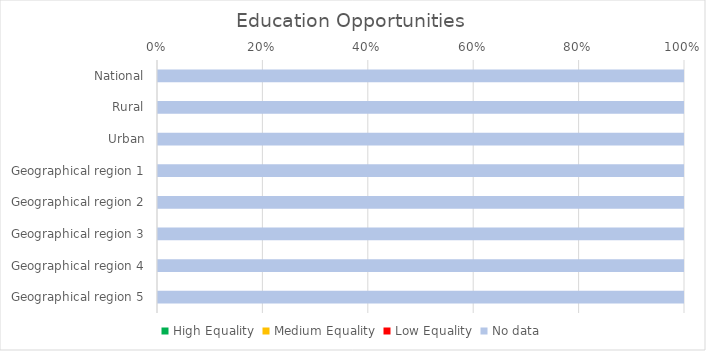
| Category | High Equality | Medium Equality | Low Equality | No data |
|---|---|---|---|---|
| National | 0 | 0 | 0 | 11 |
| Rural | 0 | 0 | 0 | 11 |
| Urban | 0 | 0 | 0 | 11 |
| Geographical region 1 | 0 | 0 | 0 | 11 |
| Geographical region 2 | 0 | 0 | 0 | 11 |
| Geographical region 3 | 0 | 0 | 0 | 11 |
| Geographical region 4 | 0 | 0 | 0 | 11 |
| Geographical region 5 | 0 | 0 | 0 | 11 |